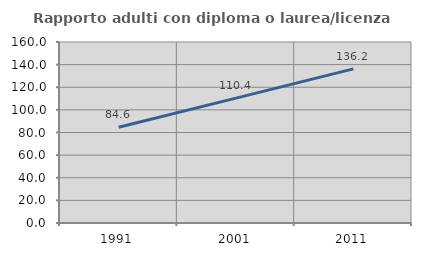
| Category | Rapporto adulti con diploma o laurea/licenza media  |
|---|---|
| 1991.0 | 84.615 |
| 2001.0 | 110.407 |
| 2011.0 | 136.232 |